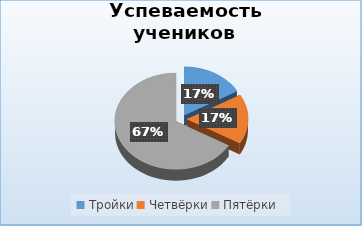
| Category | Series 0 |
|---|---|
| Тройки | 1 |
| Четвёрки | 1 |
| Пятёрки | 4 |